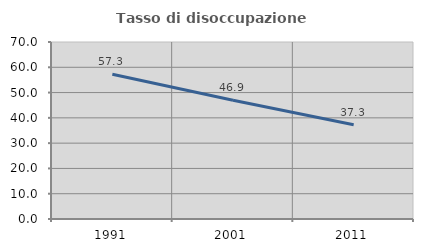
| Category | Tasso di disoccupazione giovanile  |
|---|---|
| 1991.0 | 57.273 |
| 2001.0 | 46.944 |
| 2011.0 | 37.265 |